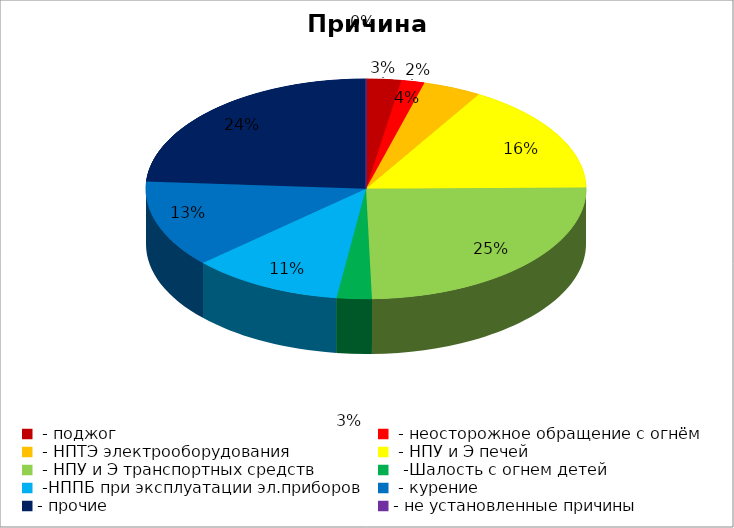
| Category | Причина пожара |
|---|---|
|  - поджог | 3 |
|  - неосторожное обращение с огнём | 2 |
|  - НПТЭ электрооборудования | 5 |
|  - НПУ и Э печей | 19 |
|  - НПУ и Э транспортных средств | 29 |
|   -Шалость с огнем детей | 3 |
|  -НППБ при эксплуатации эл.приборов | 13 |
|  - курение | 15 |
| - прочие | 28 |
| - не установленные причины | 0 |